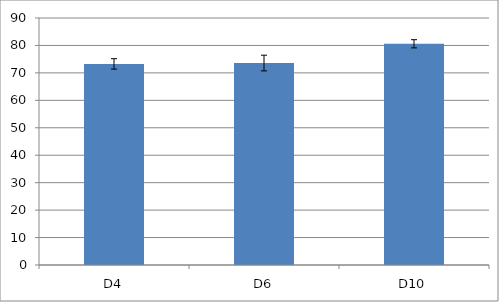
| Category | Series 0 |
|---|---|
| D4 | 73.273 |
| D6 | 73.587 |
| D10 | 80.604 |